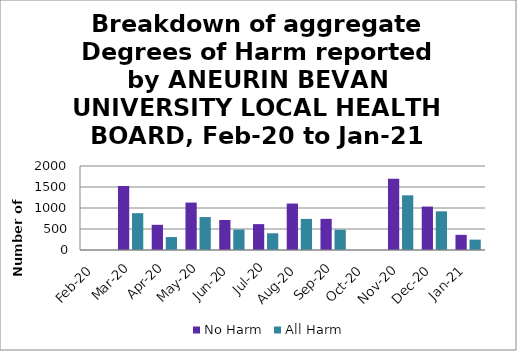
| Category | No Harm | All Harm |
|---|---|---|
| Feb-20 | 0 | 0 |
| Mar-20 | 1525 | 877 |
| Apr-20 | 600 | 308 |
| May-20 | 1129 | 784 |
| Jun-20 | 715 | 487 |
| Jul-20 | 616 | 398 |
| Aug-20 | 1106 | 740 |
| Sep-20 | 742 | 482 |
| Oct-20 | 0 | 0 |
| Nov-20 | 1699 | 1302 |
| Dec-20 | 1034 | 921 |
| Jan-21 | 361 | 247 |